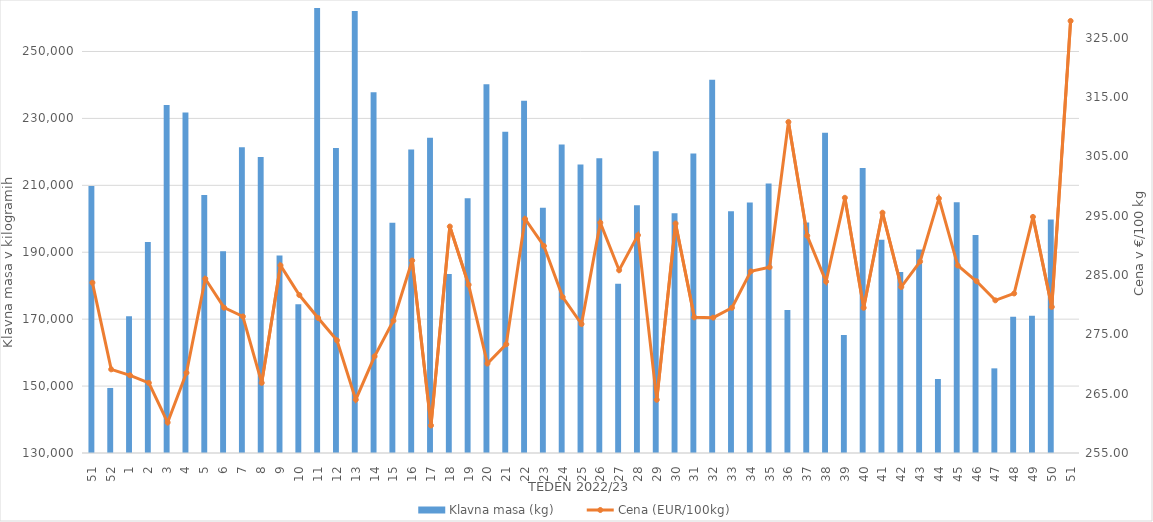
| Category | Klavna masa (kg) |
|---|---|
| 51.0 | 209797 |
| 52.0 | 149439 |
| 1.0 | 170843 |
| 2.0 | 193093 |
| 3.0 | 234042 |
| 4.0 | 231737 |
| 5.0 | 207136 |
| 6.0 | 190311 |
| 7.0 | 221366 |
| 8.0 | 218470 |
| 9.0 | 189006 |
| 10.0 | 174425 |
| 11.0 | 265476 |
| 12.0 | 221171 |
| 13.0 | 262102 |
| 14.0 | 237813 |
| 15.0 | 198828 |
| 16.0 | 220686 |
| 17.0 | 224192 |
| 18.0 | 183508 |
| 19.0 | 206133 |
| 20.0 | 240223 |
| 21.0 | 226050 |
| 22.0 | 235273 |
| 23.0 | 203306 |
| 24.0 | 222178 |
| 25.0 | 216259 |
| 26.0 | 218064 |
| 27.0 | 180556 |
| 28.0 | 204078 |
| 29.0 | 220162 |
| 30.0 | 201649 |
| 31.0 | 219538 |
| 32.0 | 241549 |
| 33.0 | 202261 |
| 34.0 | 204903 |
| 35.0 | 210575 |
| 36.0 | 172745 |
| 37.0 | 198877 |
| 38.0 | 225730 |
| 39.0 | 165273 |
| 40.0 | 215175 |
| 41.0 | 193769 |
| 42.0 | 184122 |
| 43.0 | 190834 |
| 44.0 | 152119 |
| 45.0 | 204974 |
| 46.0 | 195179 |
| 47.0 | 155300 |
| 48.0 | 170687 |
| 49.0 | 171040 |
| 50.0 | 199802 |
| 51.0 | 59936 |